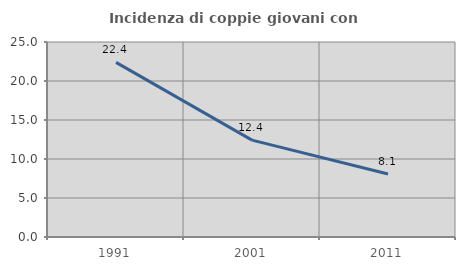
| Category | Incidenza di coppie giovani con figli |
|---|---|
| 1991.0 | 22.388 |
| 2001.0 | 12.42 |
| 2011.0 | 8.07 |